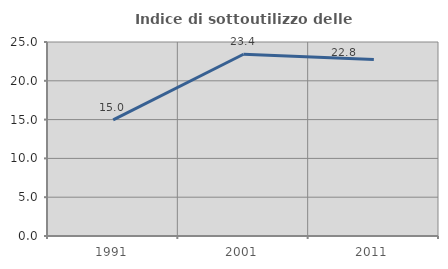
| Category | Indice di sottoutilizzo delle abitazioni  |
|---|---|
| 1991.0 | 14.956 |
| 2001.0 | 23.418 |
| 2011.0 | 22.755 |